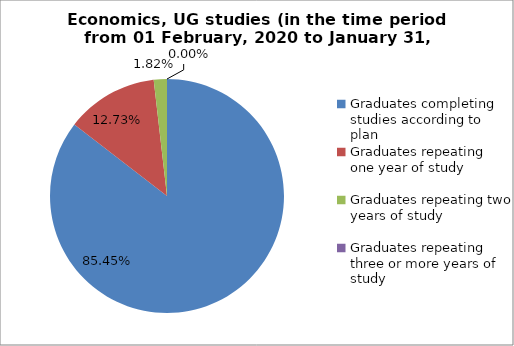
| Category | Series 0 |
|---|---|
| Graduates completing studies according to plan | 85.455 |
| Graduates repeating one year of study | 12.727 |
| Graduates repeating two years of study | 1.818 |
| Graduates repeating three or more years of study | 0 |